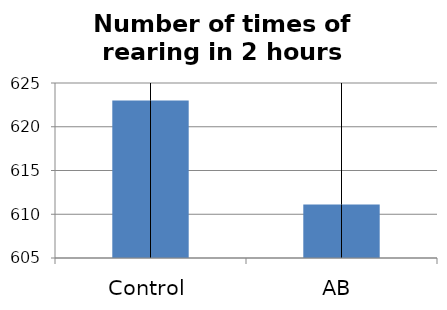
| Category | Average |
|---|---|
| Control | 623 |
| AB | 611.111 |